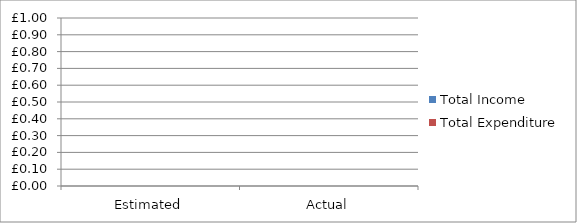
| Category | Total Income | Total Expenditure |
|---|---|---|
| Estimated | 0 | 0 |
| Actual | 0 | 0 |